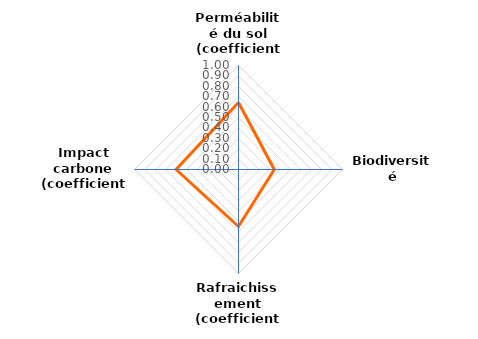
| Category | Series 0 |
|---|---|
| Perméabilité du sol (coefficient) | 0.644 |
| Biodiversité (coefficient) | 0.344 |
| Rafraichissement (coefficient) | 0.548 |
| Impact carbone (coefficient) | 0.6 |